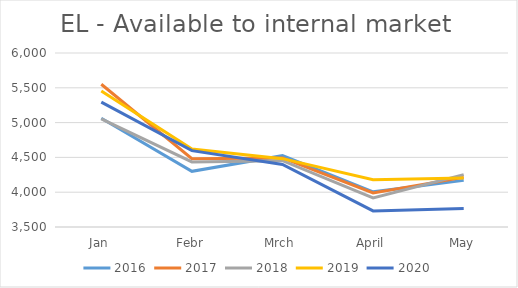
| Category | 2016 | 2017 | 2018 | 2019 | 2020 |
|---|---|---|---|---|---|
| Jan | 5063 | 5550.875 | 5054.573 | 5455.562 | 5294.38 |
| Febr | 4300 | 4481.545 | 4435.298 | 4619.251 | 4597.341 |
| Mrch | 4525 | 4492.349 | 4452.799 | 4482.228 | 4398.722 |
| April | 4005 | 3989.165 | 3917.683 | 4180.444 | 3730.475 |
| May | 4170 | 4212.741 | 4252.817 | 4202.394 | 3764.832 |